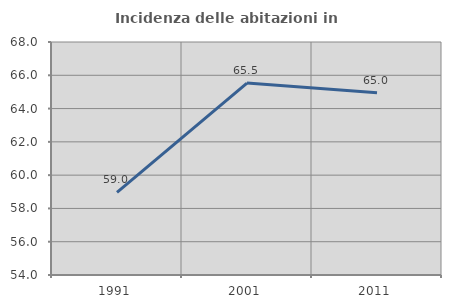
| Category | Incidenza delle abitazioni in proprietà  |
|---|---|
| 1991.0 | 58.967 |
| 2001.0 | 65.531 |
| 2011.0 | 64.953 |